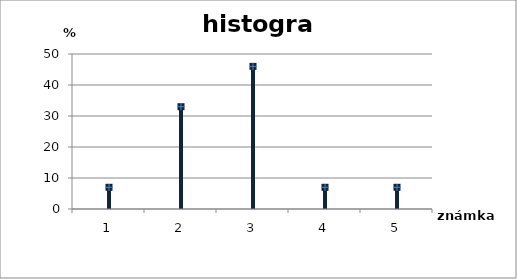
| Category | Series 0 |
|---|---|
| 0 | 7 |
| 1 | 33 |
| 2 | 46 |
| 3 | 7 |
| 4 | 7 |